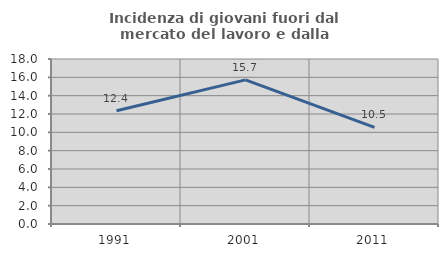
| Category | Incidenza di giovani fuori dal mercato del lavoro e dalla formazione  |
|---|---|
| 1991.0 | 12.353 |
| 2001.0 | 15.722 |
| 2011.0 | 10.544 |